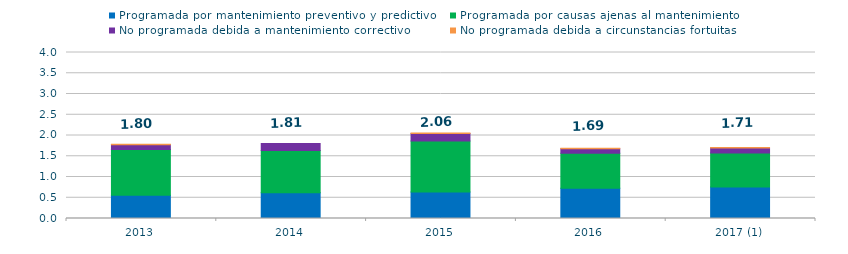
| Category | Programada por mantenimiento preventivo y predictivo | Programada por causas ajenas al mantenimiento  | No programada debida a mantenimiento correctivo  | No programada debida a circunstancias fortuitas  |
|---|---|---|---|---|
| 2013 | 0.56 | 1.1 | 0.12 | 0.01 |
| 2014 | 0.62 | 1.02 | 0.17 | 0 |
| 2015 | 0.64 | 1.23 | 0.18 | 0.01 |
| 2016 | 0.73 | 0.84 | 0.11 | 0.01 |
| 2017 (1) | 0.76 | 0.82 | 0.12 | 0.01 |